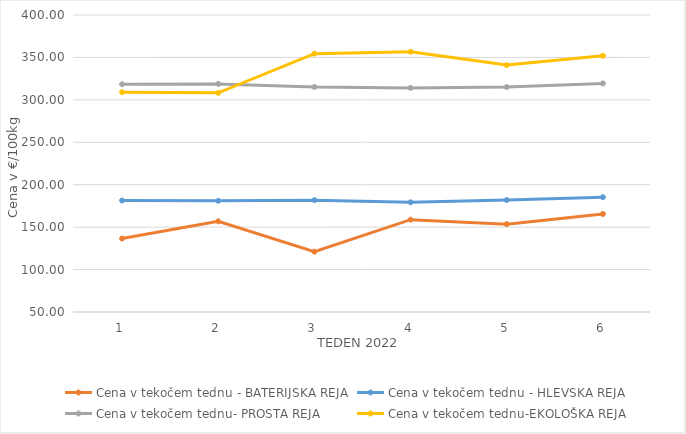
| Category | Cena v tekočem tednu - BATERIJSKA REJA | Cena v tekočem tednu - HLEVSKA REJA | Cena v tekočem tednu- PROSTA REJA | Cena v tekočem tednu-EKOLOŠKA REJA |
|---|---|---|---|---|
| 1.0 | 136.59 | 181.38 | 318.4 | 308.97 |
| 2.0 | 156.88 | 181.07 | 318.82 | 308.28 |
| 3.0 | 121.07 | 181.83 | 315.14 | 354.48 |
| 4.0 | 158.82 | 179.22 | 314.08 | 356.72 |
| 5.0 | 153.55 | 181.96 | 315.1 | 341.03 |
| 6.0 | 165.51 | 185.31 | 319.38 | 351.9 |